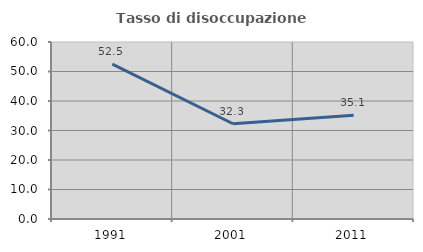
| Category | Tasso di disoccupazione giovanile  |
|---|---|
| 1991.0 | 52.478 |
| 2001.0 | 32.292 |
| 2011.0 | 35.135 |